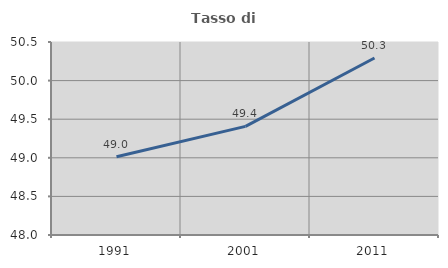
| Category | Tasso di occupazione   |
|---|---|
| 1991.0 | 49.014 |
| 2001.0 | 49.407 |
| 2011.0 | 50.293 |